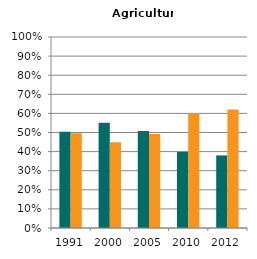
| Category | Male | Female |
|---|---|---|
| 1991.0 | 0.504 | 0.496 |
| 2000.0 | 0.551 | 0.449 |
| 2005.0 | 0.508 | 0.492 |
| 2010.0 | 0.399 | 0.601 |
| 2012.0 | 0.38 | 0.62 |